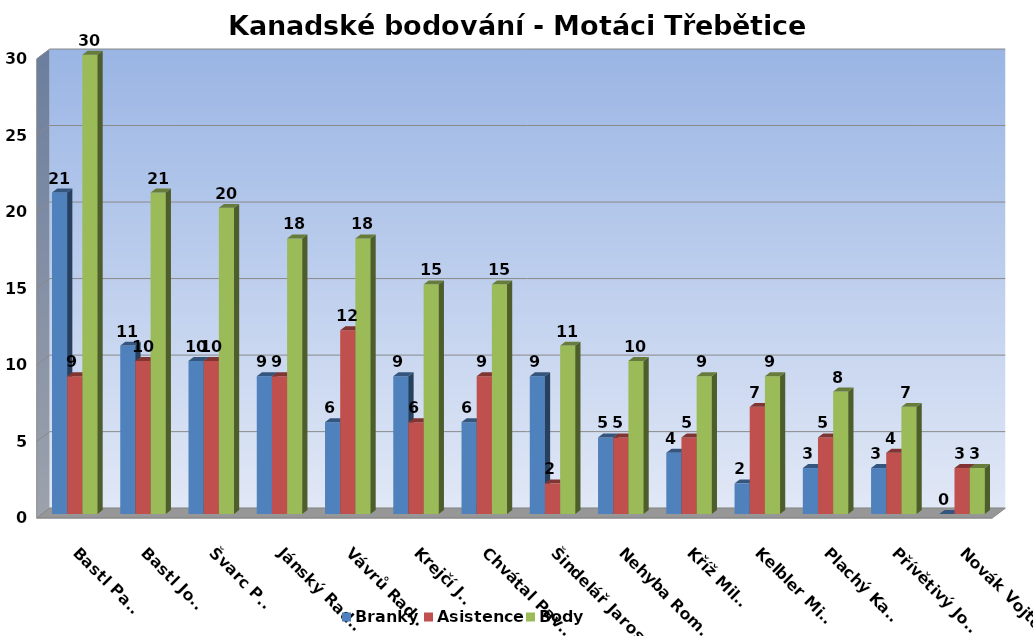
| Category | Branky | Asistence | Body |
|---|---|---|---|
| Bastl Pavel | 21 | 9 | 30 |
| Bastl Josef | 11 | 10 | 21 |
| Švarc Petr | 10 | 10 | 20 |
| Jánský Radek | 9 | 9 | 18 |
| Vávrů Radim | 6 | 12 | 18 |
| Krejčí Jiří | 9 | 6 | 15 |
| Chvátal Pavel  | 6 | 9 | 15 |
| Šindelář Jaroslav | 9 | 2 | 11 |
| Nehyba Roman | 5 | 5 | 10 |
| Kříž Milan | 4 | 5 | 9 |
| Kelbler Miloš | 2 | 7 | 9 |
| Plachý Karel | 3 | 5 | 8 |
| Přívětivý Josef | 3 | 4 | 7 |
| Novák Vojtěch | 0 | 3 | 3 |